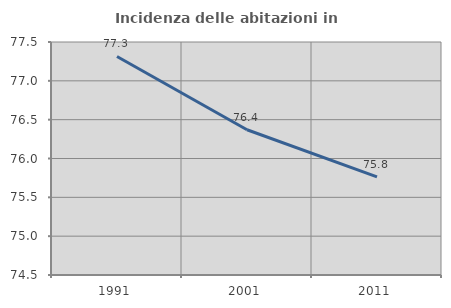
| Category | Incidenza delle abitazioni in proprietà  |
|---|---|
| 1991.0 | 77.314 |
| 2001.0 | 76.371 |
| 2011.0 | 75.764 |